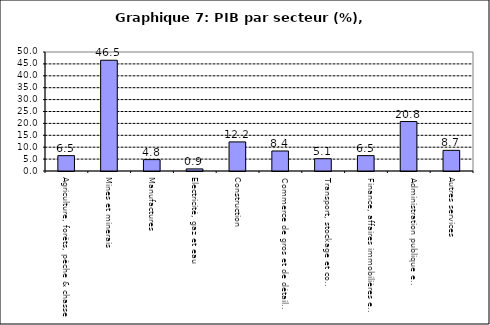
| Category | Series 0 |
|---|---|
| Agriculture, forêts, pêche & chasse | 6.456 |
| Mines et minerais | 46.534 |
| Manufactures | 4.789 |
| Electricité, gaz et eau | 0.879 |
| Construction | 12.219 |
| Commerce de gros et de détail, hôtels et restaurants | 8.406 |
| Transport, stockage et communications                | 5.148 |
| Finance, affaires immobilières et services | 6.461 |
| Administration publique et defense       | 20.773 |
| Autres services                        | 8.683 |